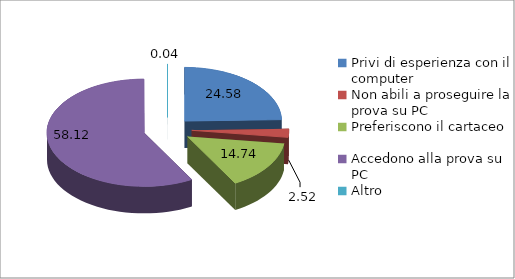
| Category | Series 0 |
|---|---|
| Privi di esperienza con il computer | 24.58 |
| Non abili a proseguire la prova su PC | 2.52 |
| Preferiscono il cartaceo | 14.74 |
| Accedono alla prova su PC | 58.12 |
| Altro  | 0.04 |